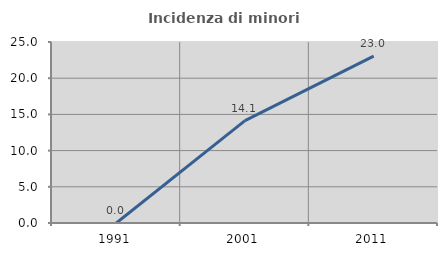
| Category | Incidenza di minori stranieri |
|---|---|
| 1991.0 | 0 |
| 2001.0 | 14.13 |
| 2011.0 | 23.049 |